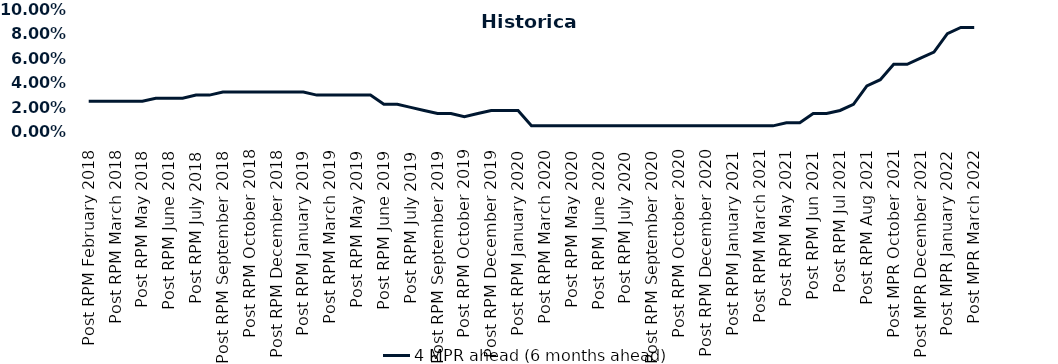
| Category | 4 MPR ahead (6 months ahead) |
|---|---|
| Post RPM February 2018 | 0.025 |
| Pre RPM March 2018 | 0.025 |
| Post RPM March 2018 | 0.025 |
| Pre RPM May 2018 | 0.025 |
| Post RPM May 2018 | 0.025 |
| Pre RPM June 2018 | 0.028 |
| Post RPM June 2018 | 0.028 |
| Pre RPM July 2018 | 0.028 |
| Post RPM July 2018 | 0.03 |
| Pre RPM September 2018 | 0.03 |
| Post RPM September 2018 | 0.032 |
| Pre RPM October 2018 | 0.032 |
| Post RPM October 2018 | 0.032 |
| Pre RPM December 2018 | 0.032 |
| Post RPM December 2018 | 0.032 |
| Pre RPM January 2019 | 0.032 |
| Post RPM January 2019 | 0.032 |
| Pre RPM March 2019 | 0.03 |
| Post RPM March 2019 | 0.03 |
| Pre RPM May 2019 | 0.03 |
| Post RPM May 2019 | 0.03 |
| Pre RPM June 2019 | 0.03 |
| Post RPM June 2019 | 0.022 |
| Pre RPM July 2019 | 0.022 |
| Post RPM July 2019 | 0.02 |
| Pre RPM September 2019 | 0.018 |
| Post RPM September 2019 | 0.015 |
| Pre RPM October 2019 | 0.015 |
| Post RPM October 2019 | 0.012 |
| Pre RPM December 2019 | 0.015 |
| Post RPM December 2019 | 0.018 |
| Pre RPM January 2020 | 0.018 |
| Post RPM January 2020 | 0.018 |
| Pre RPM March 2020 | 0.005 |
| Post RPM March 2020 | 0.005 |
| Pre RPM May 2020 | 0.005 |
| Post RPM May 2020 | 0.005 |
| Pre RPM June 2020 | 0.005 |
| Post RPM June 2020 | 0.005 |
| Pre RPM July 2020 | 0.005 |
| Post RPM July 2020 | 0.005 |
| Pre RPM September 2020 | 0.005 |
| Post RPM September 2020 | 0.005 |
| Pre RPM October 2020 | 0.005 |
| Post RPM October 2020 | 0.005 |
| Pre RPM December 2020 | 0.005 |
|  Post RPM December 2020 | 0.005 |
| Pre RPM January 2021 | 0.005 |
| Post RPM January 2021 | 0.005 |
|  Pre RPM March 2021 | 0.005 |
|  Post RPM March 2021 | 0.005 |
|  Pre RPM May 2021 | 0.005 |
|  Post RPM May 2021 | 0.008 |
|  Pre RPM Jun 2021 | 0.008 |
|   Post RPM Jun 2021 | 0.015 |
| Pre RPM Jul 2021 | 0.015 |
|  Post RPM Jul 2021 | 0.018 |
| Pre RPM Aug 2021 | 0.022 |
|  Post RPM Aug 2021 | 0.038 |
| Pre MPR October 2021 | 0.042 |
| Post MPR October 2021 | 0.055 |
| Pre MPR December 2021 | 0.055 |
| Post MPR December 2021 | 0.06 |
| Pre MPR January 2022 | 0.065 |
| Post MPR January 2022 | 0.08 |
| Pre MPR March 2022 | 0.085 |
| Post MPR March 2022 | 0.085 |